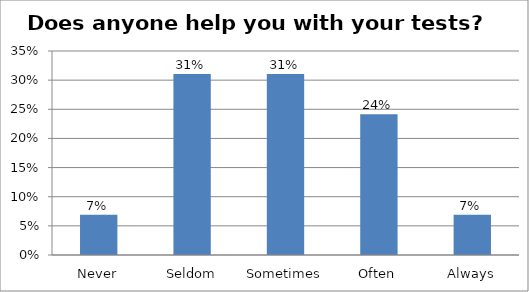
| Category | Series 0 |
|---|---|
| Never | 0.069 |
| Seldom | 0.31 |
| Sometimes | 0.31 |
| Often | 0.241 |
| Always | 0.069 |